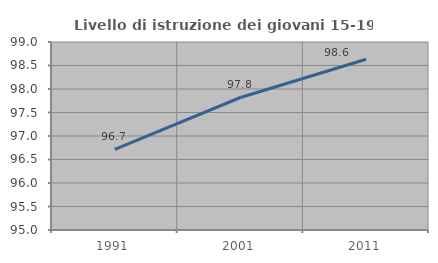
| Category | Livello di istruzione dei giovani 15-19 anni |
|---|---|
| 1991.0 | 96.714 |
| 2001.0 | 97.819 |
| 2011.0 | 98.634 |